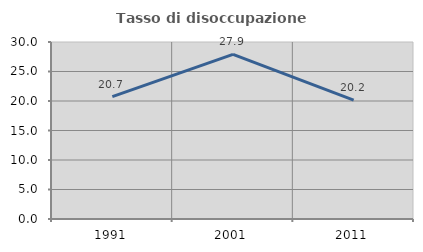
| Category | Tasso di disoccupazione giovanile  |
|---|---|
| 1991.0 | 20.732 |
| 2001.0 | 27.907 |
| 2011.0 | 20.161 |